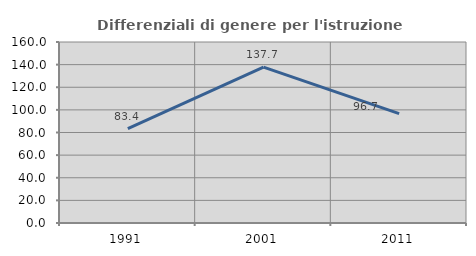
| Category | Differenziali di genere per l'istruzione superiore |
|---|---|
| 1991.0 | 83.373 |
| 2001.0 | 137.734 |
| 2011.0 | 96.689 |